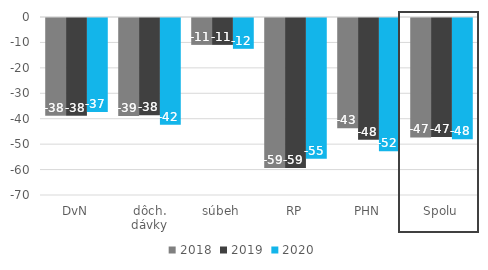
| Category | 2018 | 2019 | 2020 |
|---|---|---|---|
| DvN | -38.477 | -38.468 | -36.971 |
| dôch. dávky | -38.581 | -38.23 | -41.999 |
| súbeh | -10.575 | -10.575 | -12.123 |
| RP | -59.022 | -59.022 | -55.391 |
| PHN | -43.315 | -47.883 | -52.373 |
| Spolu | -46.968 | -46.781 | -47.698 |